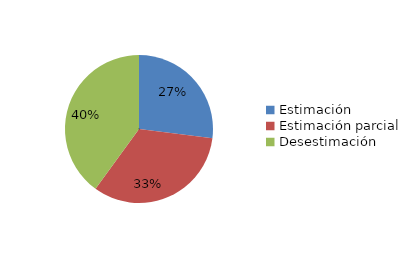
| Category | Series 0 |
|---|---|
| Estimación | 0.27 |
| Estimación parcial | 0.33 |
| Desestimación | 0.4 |